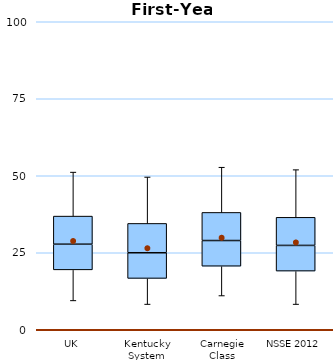
| Category | 25th | 50th | 75th |
|---|---|---|---|
| UK | 19.444 | 8.333 | 9.127 |
| Kentucky System | 16.667 | 8.333 | 9.524 |
| Carnegie Class | 20.635 | 8.333 | 9.127 |
| NSSE 2012 | 19.048 | 8.333 | 9.127 |